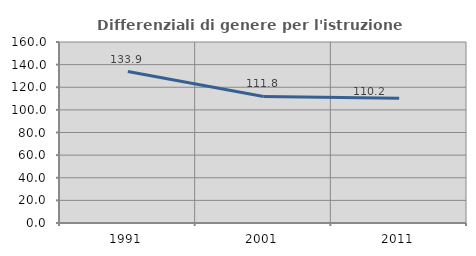
| Category | Differenziali di genere per l'istruzione superiore |
|---|---|
| 1991.0 | 133.903 |
| 2001.0 | 111.834 |
| 2011.0 | 110.178 |